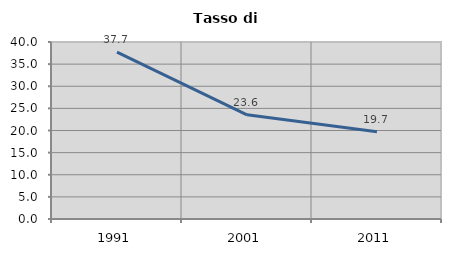
| Category | Tasso di disoccupazione   |
|---|---|
| 1991.0 | 37.69 |
| 2001.0 | 23.552 |
| 2011.0 | 19.742 |